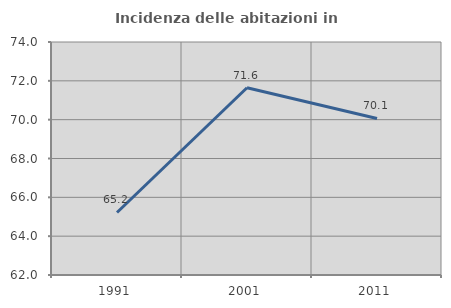
| Category | Incidenza delle abitazioni in proprietà  |
|---|---|
| 1991.0 | 65.22 |
| 2001.0 | 71.645 |
| 2011.0 | 70.064 |